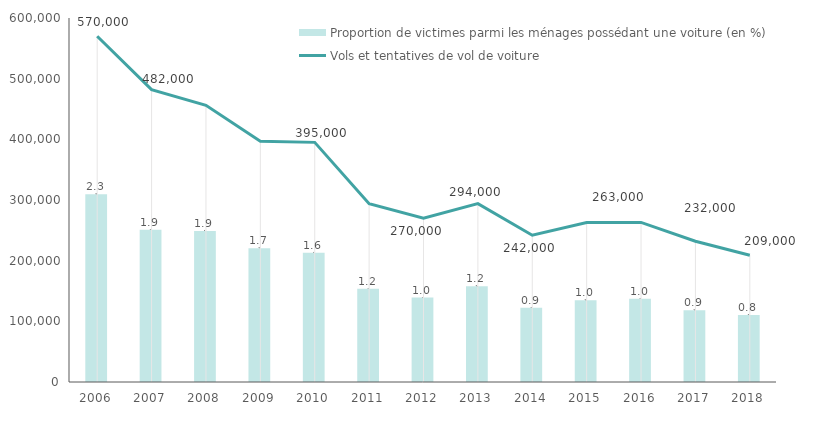
| Category | Proportion de victimes parmi les ménages possédant une voiture (en %) |
|---|---|
| 0 | 2.32 |
| 1 | 1.882 |
| 2 | 1.868 |
| 3 | 1.654 |
| 4 | 1.599 |
| 5 | 1.154 |
| 6 | 1.044 |
| 7 | 1.182 |
| 8 | 0.917 |
| 9 | 1.009 |
| 10 | 1.03 |
| 11 | 0.887 |
| 12 | 0.828 |